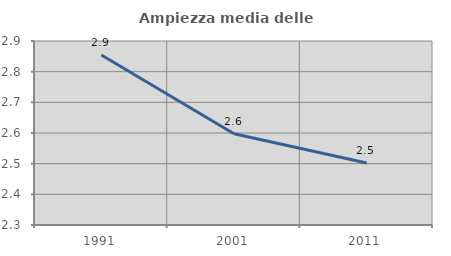
| Category | Ampiezza media delle famiglie |
|---|---|
| 1991.0 | 2.855 |
| 2001.0 | 2.598 |
| 2011.0 | 2.502 |